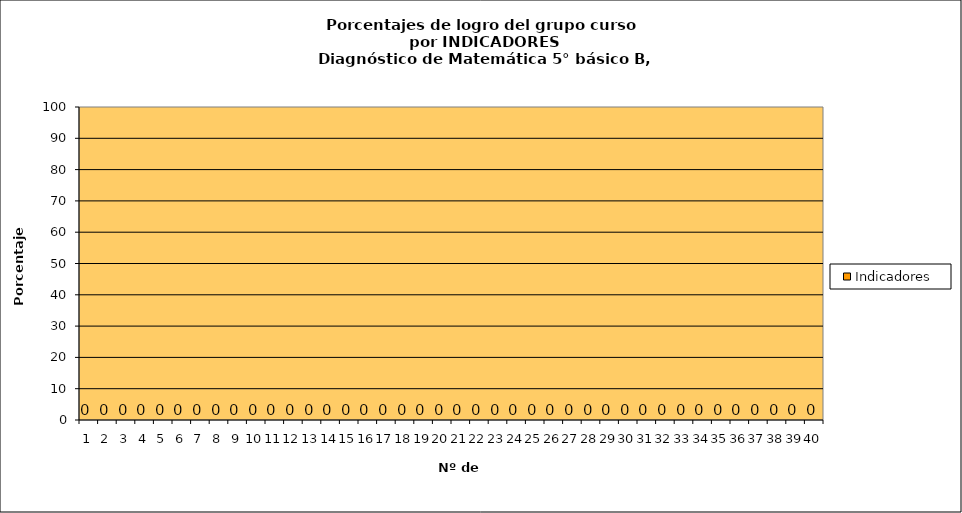
| Category | Indicadores |
|---|---|
| 0 | 0 |
| 1 | 0 |
| 2 | 0 |
| 3 | 0 |
| 4 | 0 |
| 5 | 0 |
| 6 | 0 |
| 7 | 0 |
| 8 | 0 |
| 9 | 0 |
| 10 | 0 |
| 11 | 0 |
| 12 | 0 |
| 13 | 0 |
| 14 | 0 |
| 15 | 0 |
| 16 | 0 |
| 17 | 0 |
| 18 | 0 |
| 19 | 0 |
| 20 | 0 |
| 21 | 0 |
| 22 | 0 |
| 23 | 0 |
| 24 | 0 |
| 25 | 0 |
| 26 | 0 |
| 27 | 0 |
| 28 | 0 |
| 29 | 0 |
| 30 | 0 |
| 31 | 0 |
| 32 | 0 |
| 33 | 0 |
| 34 | 0 |
| 35 | 0 |
| 36 | 0 |
| 37 | 0 |
| 38 | 0 |
| 39 | 0 |